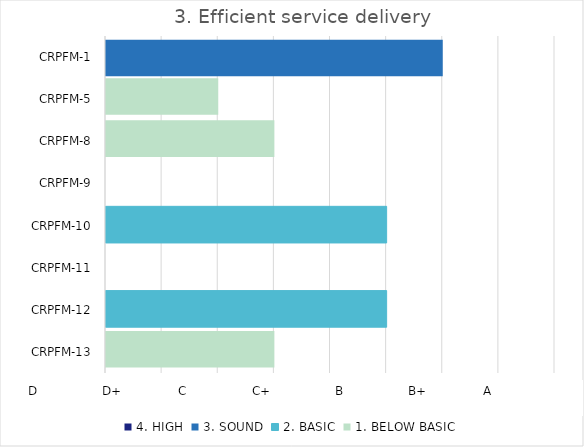
| Category | 4. HIGH | 3. SOUND | 2. BASIC | 1. BELOW BASIC |
|---|---|---|---|---|
| CRPFM-13 | 0 | 0 | 0 | 1.5 |
| CRPFM-12 | 0 | 0 | 2.5 | 0 |
| CRPFM-11 | 0 | 0 | 0 | 0 |
| CRPFM-10 | 0 | 0 | 2.5 | 0 |
| CRPFM-9 | 0 | 0 | 0 | 0 |
| CRPFM-8 | 0 | 0 | 0 | 1.5 |
| CRPFM-5 | 0 | 0 | 0 | 1 |
| CRPFM-1 | 0 | 3 | 0 | 0 |